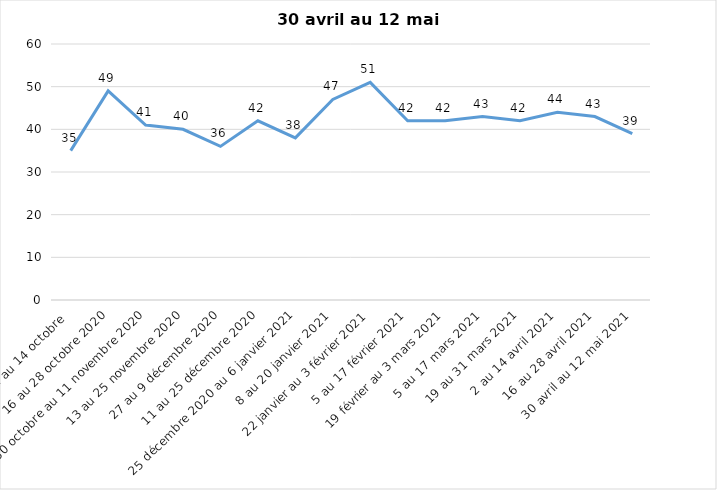
| Category | Toujours aux trois mesures |
|---|---|
| 2 au 14 octobre  | 35 |
| 16 au 28 octobre 2020 | 49 |
| 30 octobre au 11 novembre 2020 | 41 |
| 13 au 25 novembre 2020 | 40 |
| 27 au 9 décembre 2020 | 36 |
| 11 au 25 décembre 2020 | 42 |
| 25 décembre 2020 au 6 janvier 2021 | 38 |
| 8 au 20 janvier 2021 | 47 |
| 22 janvier au 3 février 2021 | 51 |
| 5 au 17 février 2021 | 42 |
| 19 février au 3 mars 2021 | 42 |
| 5 au 17 mars 2021 | 43 |
| 19 au 31 mars 2021 | 42 |
| 2 au 14 avril 2021 | 44 |
| 16 au 28 avril 2021 | 43 |
| 30 avril au 12 mai 2021 | 39 |